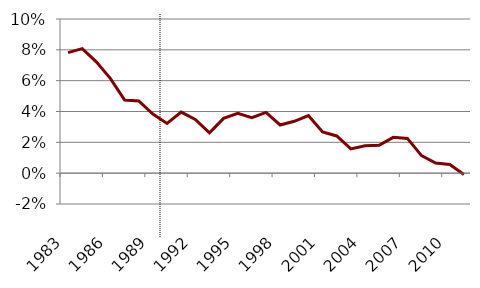
| Category | Series 0 |
|---|---|
| 1983.0 | 0.078 |
| 1984.0 | 0.081 |
| 1985.0 | 0.072 |
| 1986.0 | 0.061 |
| 1987.0 | 0.047 |
| 1988.0 | 0.047 |
| 1989.0 | 0.038 |
| 1990.0 | 0.032 |
| 1991.0 | 0.04 |
| 1992.0 | 0.035 |
| 1993.0 | 0.026 |
| 1994.0 | 0.036 |
| 1995.0 | 0.039 |
| 1996.0 | 0.036 |
| 1997.0 | 0.039 |
| 1998.0 | 0.031 |
| 1999.0 | 0.034 |
| 2000.0 | 0.037 |
| 2001.0 | 0.027 |
| 2002.0 | 0.024 |
| 2003.0 | 0.016 |
| 2004.0 | 0.018 |
| 2005.0 | 0.018 |
| 2006.0 | 0.023 |
| 2007.0 | 0.023 |
| 2008.0 | 0.011 |
| 2009.0 | 0.007 |
| 2010.0 | 0.006 |
| 2011.0 | -0.001 |